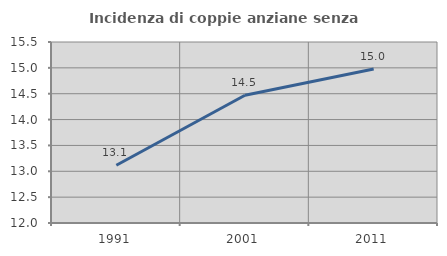
| Category | Incidenza di coppie anziane senza figli  |
|---|---|
| 1991.0 | 13.117 |
| 2001.0 | 14.47 |
| 2011.0 | 14.978 |